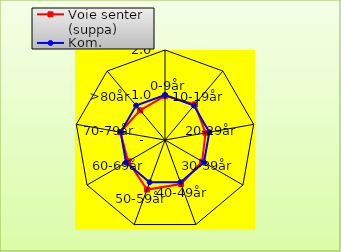
| Category | Voie senter (suppa) | Kom. |
|---|---|---|
| 0-9år | 0.981 | 1 |
| 10-19år | 1.035 | 1 |
| 20-29år | 0.914 | 1 |
| 30-39år | 0.955 | 1 |
| 40-49år | 1.042 | 1 |
| 50-59år | 1.172 | 1 |
| 60-69år | 0.948 | 1 |
| 70-79år | 1.006 | 1 |
| >80år | 0.86 | 1 |